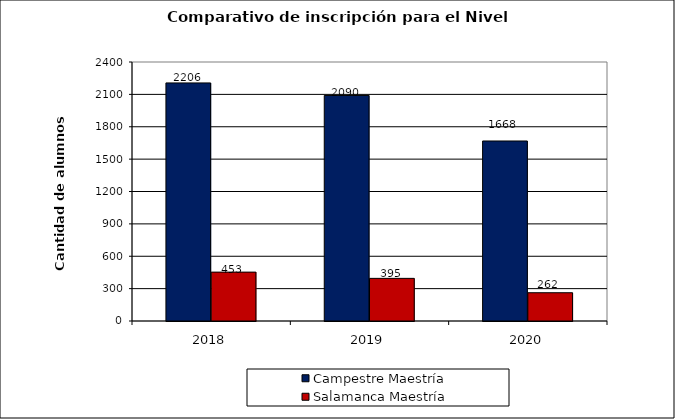
| Category | Campestre | Salamanca |
|---|---|---|
| 2018.0 | 2206 | 453 |
| 2019.0 | 2090 | 395 |
| 2020.0 | 1668 | 262 |